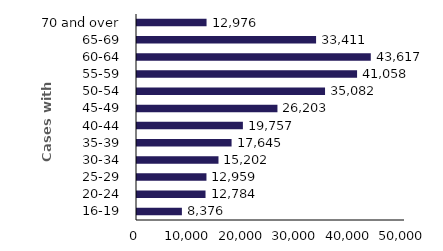
| Category | Series 0 |
|---|---|
| 16-19 | 8376 |
| 20-24 | 12784 |
| 25-29 | 12959 |
| 30-34 | 15202 |
| 35-39 | 17645 |
| 40-44 | 19757 |
| 45-49 | 26203 |
| 50-54 | 35082 |
| 55-59 | 41058 |
| 60-64 | 43617 |
| 65-69 | 33411 |
| 70 and over | 12976 |